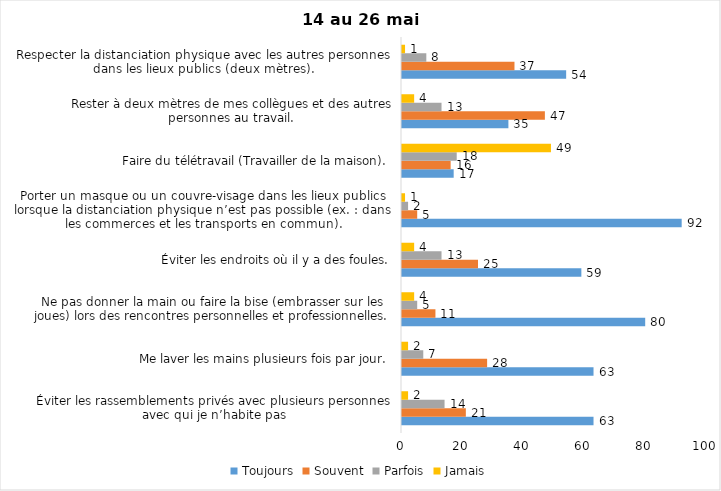
| Category | Toujours | Souvent | Parfois | Jamais |
|---|---|---|---|---|
| Éviter les rassemblements privés avec plusieurs personnes avec qui je n’habite pas | 63 | 21 | 14 | 2 |
| Me laver les mains plusieurs fois par jour. | 63 | 28 | 7 | 2 |
| Ne pas donner la main ou faire la bise (embrasser sur les joues) lors des rencontres personnelles et professionnelles. | 80 | 11 | 5 | 4 |
| Éviter les endroits où il y a des foules. | 59 | 25 | 13 | 4 |
| Porter un masque ou un couvre-visage dans les lieux publics lorsque la distanciation physique n’est pas possible (ex. : dans les commerces et les transports en commun). | 92 | 5 | 2 | 1 |
| Faire du télétravail (Travailler de la maison). | 17 | 16 | 18 | 49 |
| Rester à deux mètres de mes collègues et des autres personnes au travail. | 35 | 47 | 13 | 4 |
| Respecter la distanciation physique avec les autres personnes dans les lieux publics (deux mètres). | 54 | 37 | 8 | 1 |